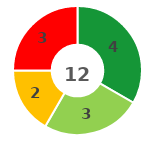
| Category | Series 0 |
|---|---|
| 0 | 4 |
| 1 | 3 |
| 2 | 2 |
| 3 | 3 |
| 4 | 0 |